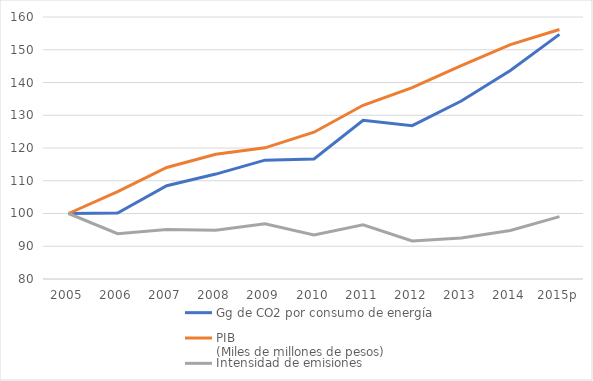
| Category | Gg de CO2 por consumo de energía | PIB 
(Miles de millones de pesos) | Intensidad de emisiones
(Gg de CO2eq/PIB) |
|---|---|---|---|
| 2005 | 100 | 100 | 100 |
| 2006 | 100.125 | 106.698 | 93.84 |
| 2007 | 108.49 | 114.06 | 95.117 |
| 2008 | 112.039 | 118.106 | 94.863 |
| 2009 | 116.289 | 120.056 | 96.862 |
| 2010 | 116.675 | 124.825 | 93.471 |
| 2011 | 128.438 | 133.05 | 96.533 |
| 2012 | 126.807 | 138.431 | 91.603 |
| 2013 | 134.337 | 145.178 | 92.533 |
| 2014 | 143.67 | 151.556 | 94.796 |
| 2015p | 154.703 | 156.182 | 99.053 |